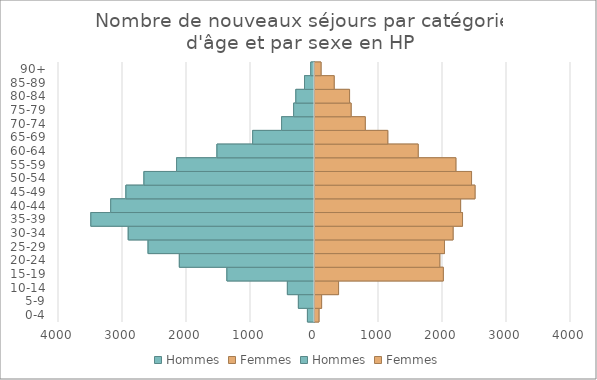
| Category | Hommes | Femmes |
|---|---|---|
| 0-4 | -110 | 62 |
| 5-9 | -251 | 103 |
| 10-14 | -423 | 368 |
| 15-19 | -1368 | 2005 |
| 20-24 | -2111 | 1950 |
| 25-29 | -2599 | 2023 |
| 30-34 | -2909 | 2157 |
| 35-39 | -3494 | 2305 |
| 40-44 | -3184 | 2275 |
| 45-49 | -2946 | 2500 |
| 50-54 | -2664 | 2446 |
| 55-59 | -2155 | 2201 |
| 60-64 | -1523 | 1612 |
| 65-69 | -966 | 1137 |
| 70-74 | -514 | 785 |
| 75-79 | -326 | 564 |
| 80-84 | -291 | 540 |
| 85-89 | -156 | 299 |
| 90+ | -58 | 94 |